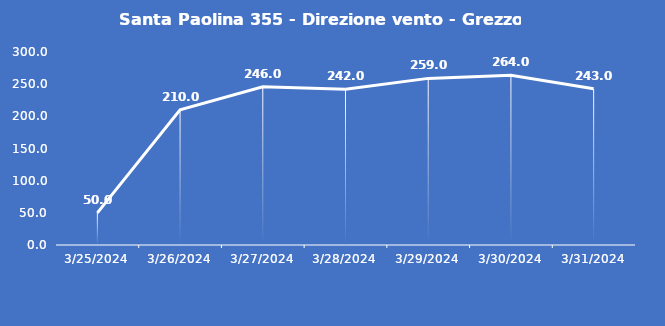
| Category | Santa Paolina 355 - Direzione vento - Grezzo (°N) |
|---|---|
| 3/25/24 | 50 |
| 3/26/24 | 210 |
| 3/27/24 | 246 |
| 3/28/24 | 242 |
| 3/29/24 | 259 |
| 3/30/24 | 264 |
| 3/31/24 | 243 |